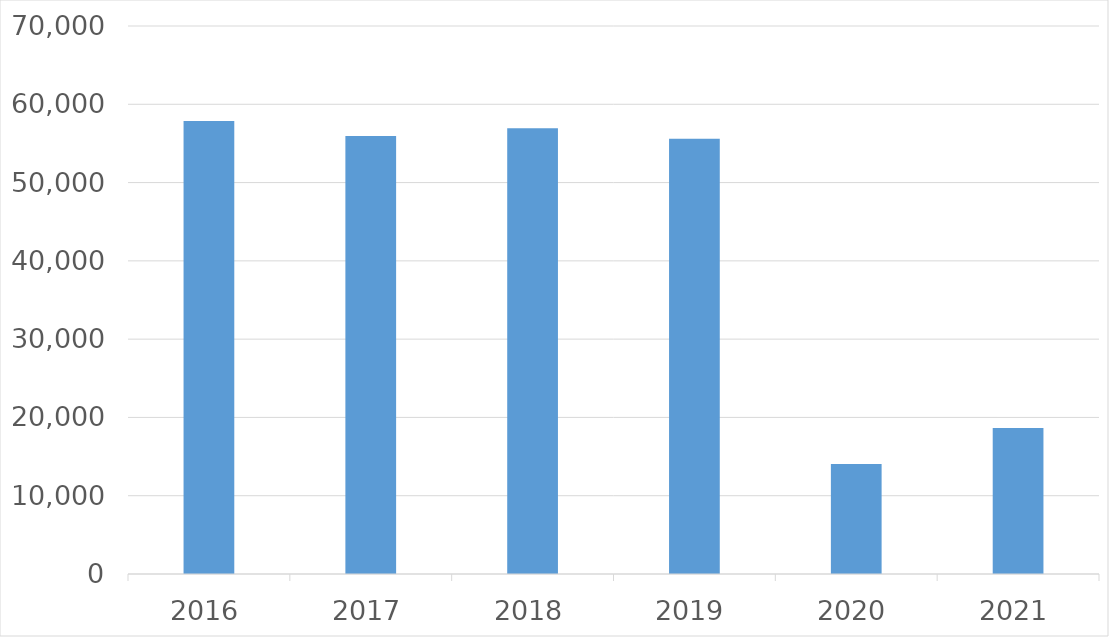
| Category | Series 0 |
|---|---|
| 2016 | 57858 |
| 2017 | 55964 |
| 2018 | 56943 |
| 2019 | 55597 |
| 2020 | 14045 |
| 2021 | 18659 |